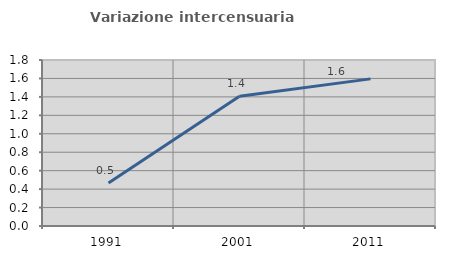
| Category | Variazione intercensuaria annua |
|---|---|
| 1991.0 | 0.465 |
| 2001.0 | 1.408 |
| 2011.0 | 1.595 |